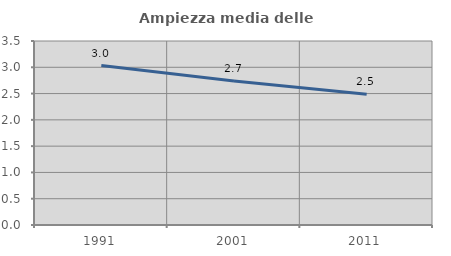
| Category | Ampiezza media delle famiglie |
|---|---|
| 1991.0 | 3.032 |
| 2001.0 | 2.741 |
| 2011.0 | 2.489 |